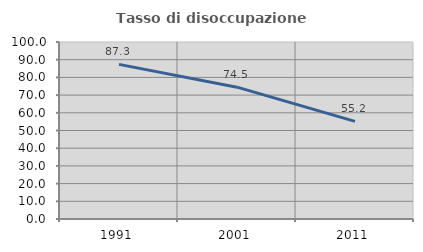
| Category | Tasso di disoccupazione giovanile  |
|---|---|
| 1991.0 | 87.346 |
| 2001.0 | 74.476 |
| 2011.0 | 55.172 |